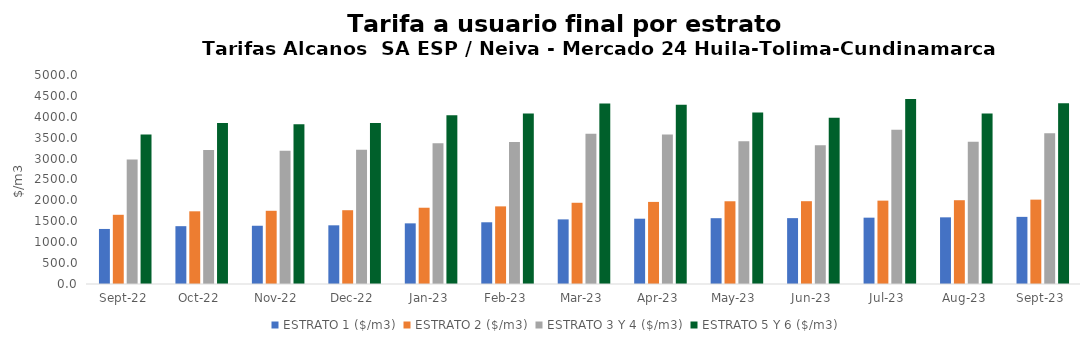
| Category | ESTRATO 1 ($/m3) | ESTRATO 2 ($/m3) | ESTRATO 3 Y 4 ($/m3) | ESTRATO 5 Y 6 ($/m3) |
|---|---|---|---|---|
| 2022-09-01 | 1316.79 | 1655.76 | 2979.32 | 3575.184 |
| 2022-10-01 | 1383.39 | 1739.03 | 3208.12 | 3849.744 |
| 2022-11-01 | 1393.41 | 1751.52 | 3185.9 | 3823.08 |
| 2022-12-01 | 1403.94 | 1765.16 | 3209.93 | 3851.916 |
| 2023-01-01 | 1450.9 | 1824.58 | 3365.49 | 4038.588 |
| 2023-02-01 | 1476.55 | 1857.05 | 3398.26 | 4077.912 |
| 2023-03-01 | 1545.84 | 1943.33 | 3596.1 | 4315.32 |
| 2023-04-01 | 1562.23 | 1963.79 | 3575.22 | 4290.264 |
| 2023-05-01 | 1574.25 | 1979.21 | 3416.65 | 4099.98 |
| 2023-06-01 | 1575.71 | 1980.83 | 3316.57 | 3979.884 |
| 2023-07-01 | 1586.9 | 1994.23 | 3689.81 | 4427.772 |
| 2023-08-01 | 1594.84 | 2004.4 | 3401.48 | 4081.776 |
| 2023-09-01 | 1606 | 2018.25 | 3603.59 | 4324.308 |